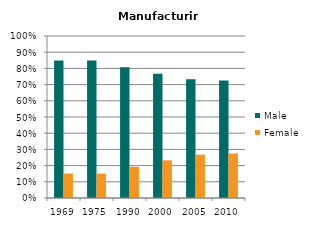
| Category | Male | Female |
|---|---|---|
| 1969.0 | 0.849 | 0.151 |
| 1975.0 | 0.849 | 0.151 |
| 1990.0 | 0.807 | 0.193 |
| 2000.0 | 0.768 | 0.232 |
| 2005.0 | 0.732 | 0.268 |
| 2010.0 | 0.726 | 0.274 |